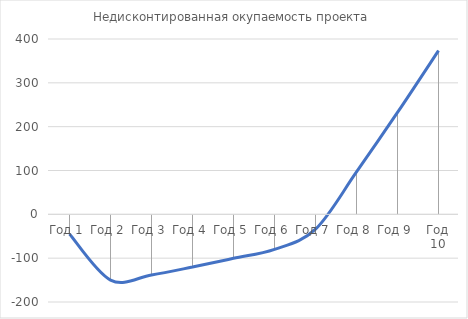
| Category | Недисконтированная окупаемость проекта |
|---|---|
| Год 1 | -44.995 |
| Год 2 | -149.985 |
| Год 3 | -138.313 |
| Год 4 | -120.161 |
| Год 5 | -100.375 |
| Год 6 | -79.962 |
| Год 7 | -33.897 |
| Год 8 | 96.667 |
| Год 9 | 232.407 |
| Год 10 | 373.525 |